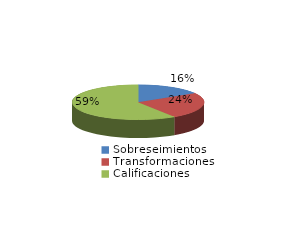
| Category | Series 0 |
|---|---|
| Sobreseimientos | 3669 |
| Transformaciones | 5525 |
| Calificaciones | 13364 |